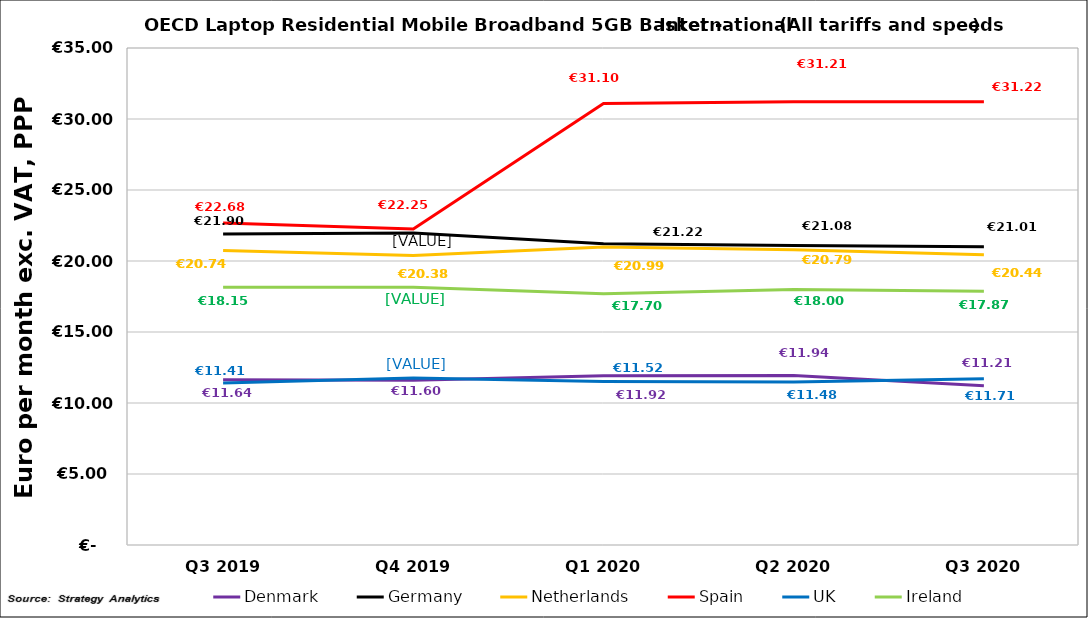
| Category | Denmark | Germany | Netherlands | Spain | UK | Ireland |
|---|---|---|---|---|---|---|
| Q3 2019 | 11.637 | 21.902 | 20.744 | 22.678 | 11.411 | 18.152 |
| Q4 2019 | 11.6 | 21.975 | 20.38 | 22.248 | 11.758 | 18.152 |
| Q1 2020 | 11.92 | 21.218 | 20.992 | 31.099 | 11.517 | 17.699 |
| Q2 2020 | 11.936 | 21.084 | 20.793 | 31.215 | 11.475 | 18 |
| Q3 2020 | 11.208 | 21.008 | 20.438 | 31.223 | 11.708 | 17.87 |